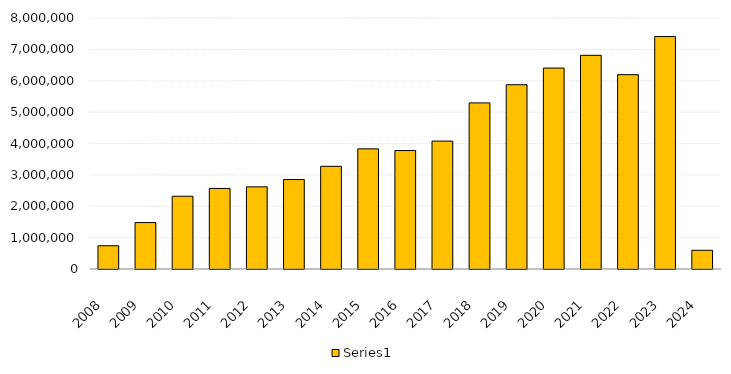
| Category | Series 0 |
|---|---|
| 2008.0 | 740750 |
| 2009.0 | 1479892 |
| 2010.0 | 2318874 |
| 2011.0 | 2567704 |
| 2012.0 | 2618620 |
| 2013.0 | 2851046 |
| 2014.0 | 3272260 |
| 2015.0 | 3829025.329 |
| 2016.0 | 3775869.712 |
| 2017.0 | 4076755.288 |
| 2018.0 | 5293930.505 |
| 2019.0 | 5873557.825 |
| 2020.0 | 6404629.537 |
| 2021.0 | 6810363.932 |
| 2022.0 | 6193857.311 |
| 2023.0 | 7407920.679 |
| 2024.0 | 597094.025 |